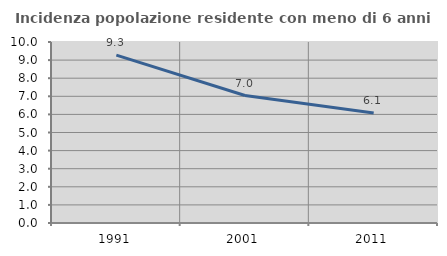
| Category | Incidenza popolazione residente con meno di 6 anni |
|---|---|
| 1991.0 | 9.277 |
| 2001.0 | 7.041 |
| 2011.0 | 6.071 |